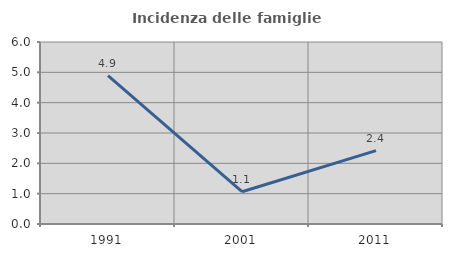
| Category | Incidenza delle famiglie numerose |
|---|---|
| 1991.0 | 4.895 |
| 2001.0 | 1.064 |
| 2011.0 | 2.421 |